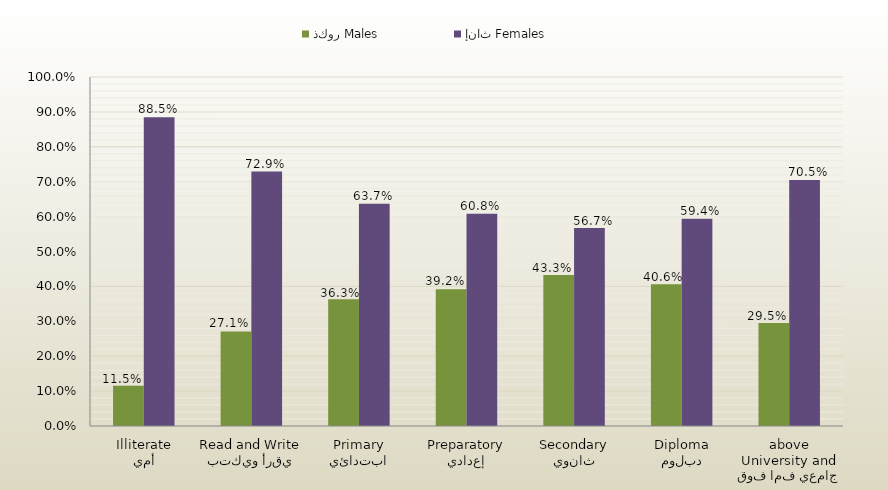
| Category | ذكور Males | إناث Females |
|---|---|---|
| أمي
Illiterate | 0.115 | 0.885 |
| يقرأ ويكتب
Read and Write | 0.271 | 0.729 |
| ابتدائي
Primary | 0.363 | 0.637 |
| إعدادي
Preparatory | 0.392 | 0.608 |
| ثانوي
Secondary | 0.433 | 0.567 |
| دبلوم
Diploma | 0.406 | 0.594 |
| جامعي فما فوق
University and above | 0.295 | 0.705 |